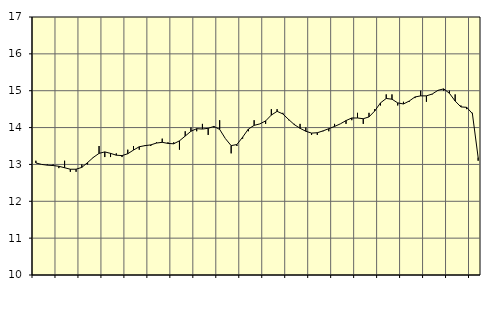
| Category | Piggar | Handel, SNI 45-47 |
|---|---|---|
| nan | 13.1 | 13.04 |
| 1.0 | 13 | 13 |
| 1.0 | 13 | 12.98 |
| 1.0 | 13 | 12.97 |
| nan | 12.9 | 12.95 |
| 2.0 | 13.1 | 12.91 |
| 2.0 | 12.8 | 12.87 |
| 2.0 | 12.8 | 12.87 |
| nan | 13 | 12.92 |
| 3.0 | 13 | 13.05 |
| 3.0 | 13.2 | 13.19 |
| 3.0 | 13.5 | 13.3 |
| nan | 13.2 | 13.34 |
| 4.0 | 13.2 | 13.3 |
| 4.0 | 13.3 | 13.25 |
| 4.0 | 13.2 | 13.24 |
| nan | 13.4 | 13.29 |
| 5.0 | 13.5 | 13.39 |
| 5.0 | 13.4 | 13.48 |
| 5.0 | 13.5 | 13.51 |
| nan | 13.5 | 13.53 |
| 6.0 | 13.6 | 13.58 |
| 6.0 | 13.7 | 13.6 |
| 6.0 | 13.6 | 13.57 |
| nan | 13.6 | 13.56 |
| 7.0 | 13.4 | 13.64 |
| 7.0 | 13.9 | 13.77 |
| 7.0 | 14 | 13.9 |
| nan | 13.9 | 13.97 |
| 8.0 | 14.1 | 13.96 |
| 8.0 | 13.8 | 13.98 |
| 8.0 | 14 | 14.03 |
| nan | 14.2 | 13.95 |
| 9.0 | 13.7 | 13.7 |
| 9.0 | 13.3 | 13.51 |
| 9.0 | 13.5 | 13.54 |
| nan | 13.7 | 13.74 |
| 10.0 | 13.9 | 13.96 |
| 10.0 | 14.2 | 14.06 |
| 10.0 | 14.1 | 14.1 |
| nan | 14.1 | 14.18 |
| 11.0 | 14.5 | 14.34 |
| 11.0 | 14.5 | 14.44 |
| 11.0 | 14.4 | 14.37 |
| nan | 14.2 | 14.22 |
| 12.0 | 14.1 | 14.08 |
| 12.0 | 14.1 | 13.98 |
| 12.0 | 14 | 13.9 |
| nan | 13.8 | 13.85 |
| 13.0 | 13.8 | 13.86 |
| 13.0 | 13.9 | 13.91 |
| 13.0 | 13.9 | 13.97 |
| nan | 14.1 | 14.03 |
| 14.0 | 14.1 | 14.1 |
| 14.0 | 14.1 | 14.19 |
| 14.0 | 14.2 | 14.26 |
| nan | 14.4 | 14.26 |
| 15.0 | 14.1 | 14.24 |
| 15.0 | 14.4 | 14.29 |
| 15.0 | 14.5 | 14.45 |
| nan | 14.6 | 14.67 |
| 16.0 | 14.9 | 14.79 |
| 16.0 | 14.9 | 14.77 |
| 16.0 | 14.6 | 14.67 |
| nan | 14.7 | 14.64 |
| 17.0 | 14.7 | 14.72 |
| 17.0 | 14.8 | 14.83 |
| 17.0 | 15 | 14.86 |
| nan | 14.7 | 14.86 |
| 18.0 | 14.9 | 14.91 |
| 18.0 | 15 | 15.01 |
| 18.0 | 15 | 15.05 |
| nan | 15 | 14.93 |
| 19.0 | 14.9 | 14.72 |
| 19.0 | 14.6 | 14.56 |
| 19.0 | 14.5 | 14.55 |
| nan | 14.4 | 14.38 |
| 20.0 | 13.1 | 13.19 |